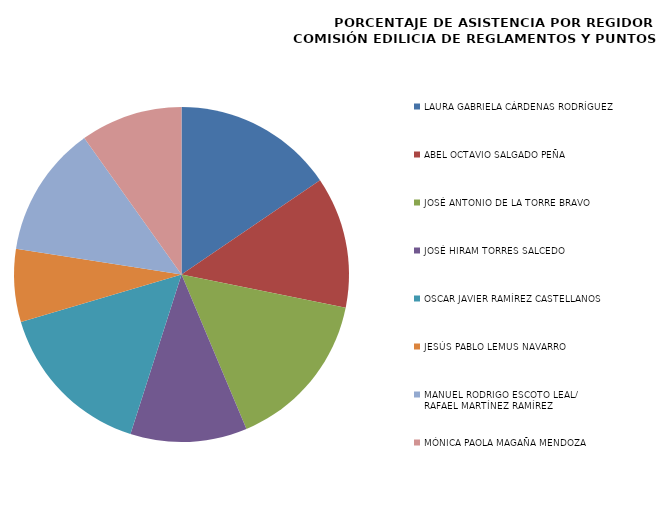
| Category | Series 0 |
|---|---|
| LAURA GABRIELA CÁRDENAS RODRÍGUEZ | 100 |
| ABEL OCTAVIO SALGADO PEÑA | 81.818 |
| JOSÉ ANTONIO DE LA TORRE BRAVO | 100 |
| JOSÉ HIRAM TORRES SALCEDO  | 72.727 |
| OSCAR JAVIER RAMÍREZ CASTELLANOS | 100 |
| JESÚS PABLO LEMUS NAVARRO | 45.455 |
| MANUEL RODRIGO ESCOTO LEAL/
RAFAEL MARTÍNEZ RAMÍREZ | 81.818 |
| MÓNICA PAOLA MAGAÑA MENDOZA | 63.636 |